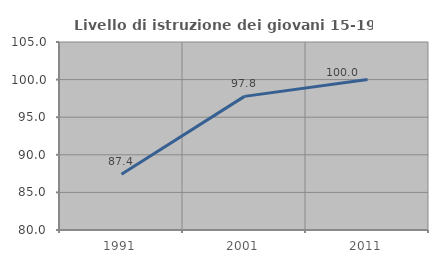
| Category | Livello di istruzione dei giovani 15-19 anni |
|---|---|
| 1991.0 | 87.419 |
| 2001.0 | 97.768 |
| 2011.0 | 100 |